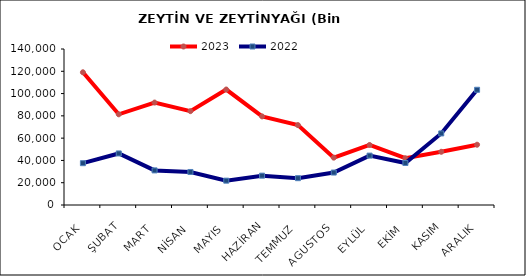
| Category | 2023 | 2022 |
|---|---|---|
| OCAK | 119104.415 | 37521.508 |
| ŞUBAT | 81393.867 | 46265.332 |
| MART | 91928.389 | 31049.38 |
| NİSAN | 84225.148 | 29631.198 |
| MAYIS | 103626.088 | 21837.589 |
| HAZİRAN | 79520.736 | 26325.635 |
| TEMMUZ | 71705.411 | 24070.126 |
| AGUSTOS | 42495.029 | 29110.842 |
| EYLÜL | 53857.131 | 44324.274 |
| EKİM | 41957.313 | 37697.345 |
| KASIM | 47757.288 | 64223.612 |
| ARALIK | 54095.505 | 103405.88 |